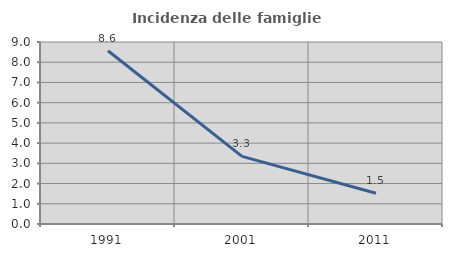
| Category | Incidenza delle famiglie numerose |
|---|---|
| 1991.0 | 8.565 |
| 2001.0 | 3.344 |
| 2011.0 | 1.522 |